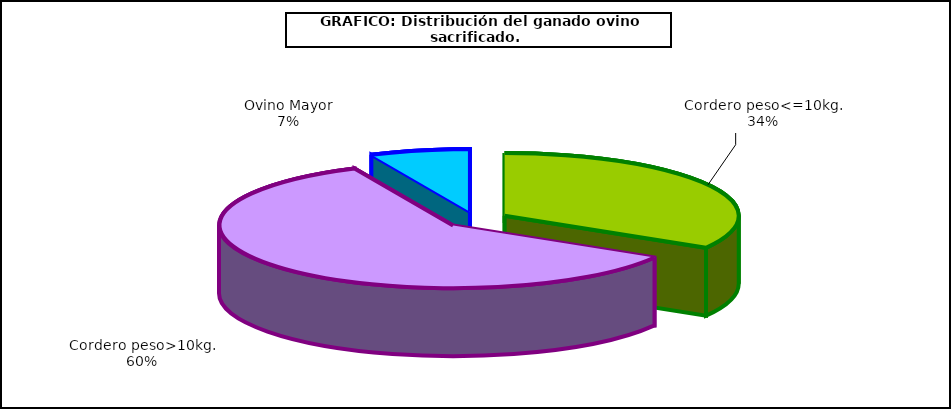
| Category | Series 0 |
|---|---|
| 0 | 3387073 |
| 1 | 6019548 |
| 2 | 699086 |